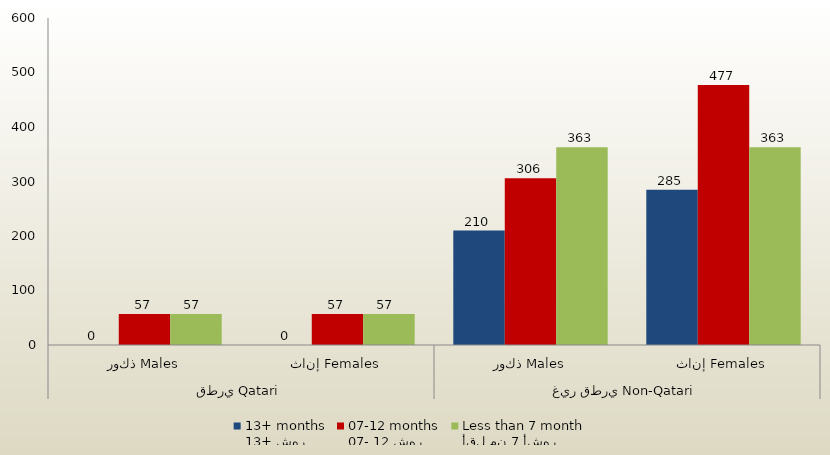
| Category | 13+ شهر
13+ months | 07- 12 شهر
07-12 months | أقل من 7 أشهر
Less than 7 month  |
|---|---|---|---|
| 0 | 0 | 57 | 57 |
| 1 | 0 | 57 | 57 |
| 2 | 210 | 306 | 363 |
| 3 | 285 | 477 | 363 |